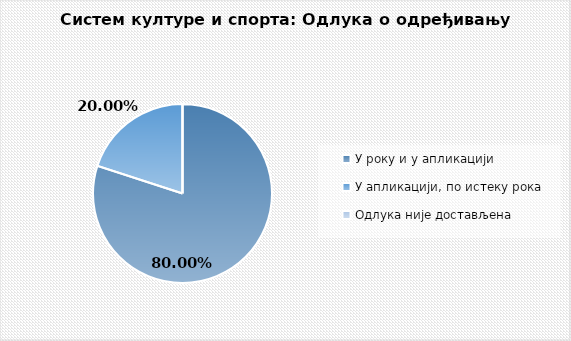
| Category | Series 0 |
|---|---|
| У року и у апликацији | 0.8 |
| У апликацији, по истеку рока | 0.2 |
| Одлука није достављена | 0 |